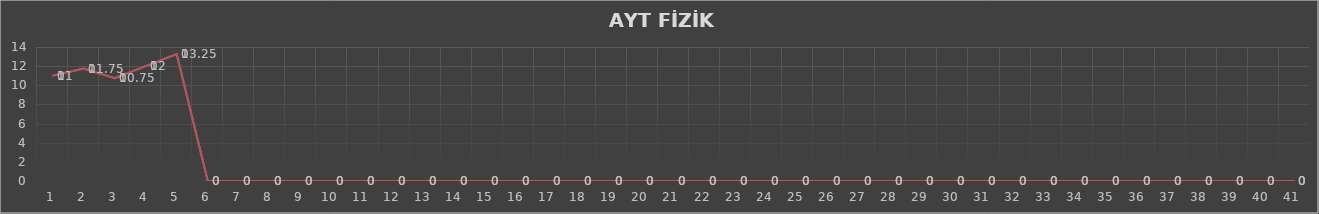
| Category | Series 0 | Series 1 |
|---|---|---|
| 0 | 11 |  |
| 1 | 11.75 |  |
| 2 | 10.75 |  |
| 3 | 12 |  |
| 4 | 13.25 |  |
| 5 | 0 |  |
| 6 | 0 |  |
| 7 | 0 |  |
| 8 | 0 |  |
| 9 | 0 |  |
| 10 | 0 |  |
| 11 | 0 |  |
| 12 | 0 |  |
| 13 | 0 |  |
| 14 | 0 |  |
| 15 | 0 |  |
| 16 | 0 |  |
| 17 | 0 |  |
| 18 | 0 |  |
| 19 | 0 |  |
| 20 | 0 |  |
| 21 | 0 |  |
| 22 | 0 |  |
| 23 | 0 |  |
| 24 | 0 |  |
| 25 | 0 |  |
| 26 | 0 |  |
| 27 | 0 |  |
| 28 | 0 |  |
| 29 | 0 |  |
| 30 | 0 |  |
| 31 | 0 |  |
| 32 | 0 |  |
| 33 | 0 |  |
| 34 | 0 |  |
| 35 | 0 |  |
| 36 | 0 |  |
| 37 | 0 |  |
| 38 | 0 |  |
| 39 | 0 |  |
| 40 | 0 |  |